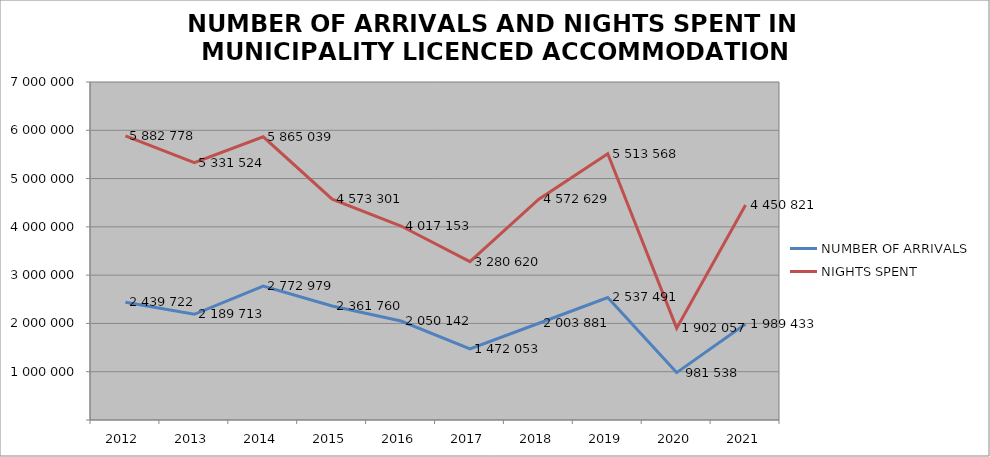
| Category | NUMBER OF ARRIVALS | NIGHTS SPENT |
|---|---|---|
| 2012 | 2439722 | 5882778 |
| 2013 | 2189713 | 5331524 |
| 2014 | 2772979 | 5865039 |
| 2015 | 2361760 | 4573301 |
| 2016 | 2050142 | 4017153 |
| 2017 | 1472053 | 3280620 |
| 2018 | 2003881 | 4572629 |
| 2019 | 2537491 | 5513568 |
| 2020 | 981538 | 1902057 |
| 2021 | 1989433 | 4450821 |